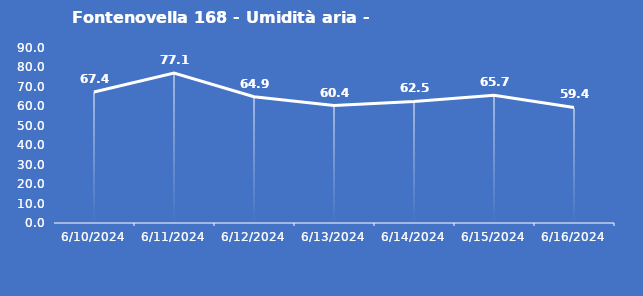
| Category | Fontenovella 168 - Umidità aria - Grezzo (%) |
|---|---|
| 6/10/24 | 67.4 |
| 6/11/24 | 77.1 |
| 6/12/24 | 64.9 |
| 6/13/24 | 60.4 |
| 6/14/24 | 62.5 |
| 6/15/24 | 65.7 |
| 6/16/24 | 59.4 |